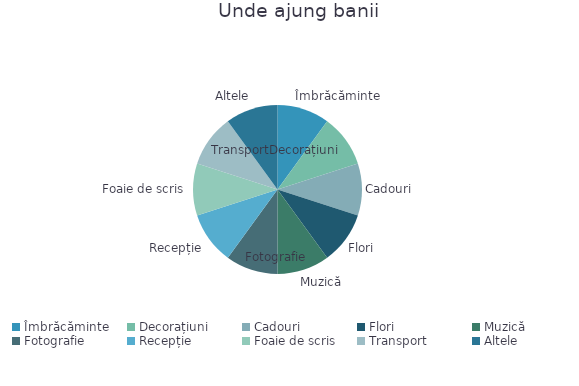
| Category | Sumă |
|---|---|
| Îmbrăcăminte | 1 |
| Decorațiuni | 1 |
| Cadouri | 1 |
| Flori | 1 |
| Muzică | 1 |
| Fotografie | 1 |
| Recepție | 1 |
| Foaie de scris | 1 |
| Transport | 1 |
| Altele | 1 |